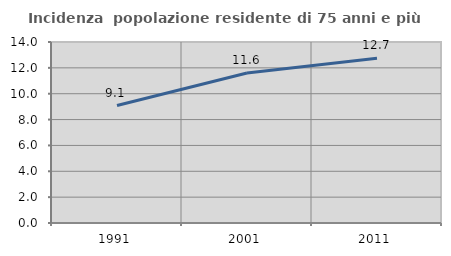
| Category | Incidenza  popolazione residente di 75 anni e più |
|---|---|
| 1991.0 | 9.083 |
| 2001.0 | 11.605 |
| 2011.0 | 12.75 |